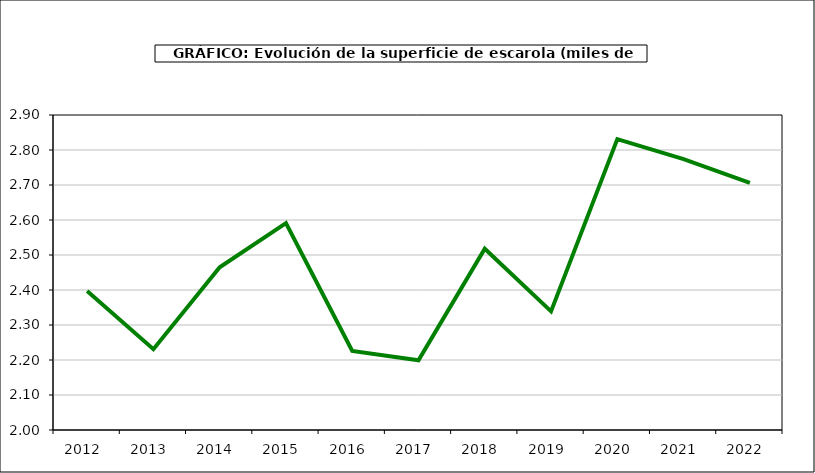
| Category | superficie |
|---|---|
| 2012.0 | 2.397 |
| 2013.0 | 2.231 |
| 2014.0 | 2.465 |
| 2015.0 | 2.591 |
| 2016.0 | 2.226 |
| 2017.0 | 2.199 |
| 2018.0 | 2.518 |
| 2019.0 | 2.339 |
| 2020.0 | 2.831 |
| 2021.0 | 2.774 |
| 2022.0 | 2.706 |